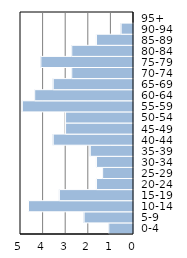
| Category | Series 0 |
|---|---|
| 0-4 | 1.093 |
| 5-9 | 2.186 |
| 10-14 | 4.645 |
| 15-19 | 3.279 |
| 20-24 | 1.639 |
| 25-29 | 1.366 |
| 30-34 | 1.639 |
| 35-39 | 1.913 |
| 40-44 | 3.552 |
| 45-49 | 3.005 |
| 50-54 | 3.005 |
| 55-59 | 4.918 |
| 60-64 | 4.372 |
| 65-69 | 3.552 |
| 70-74 | 2.732 |
| 75-79 | 4.098 |
| 80-84 | 2.732 |
| 85-89 | 1.639 |
| 90-94 | 0.546 |
| 95+ | 0 |